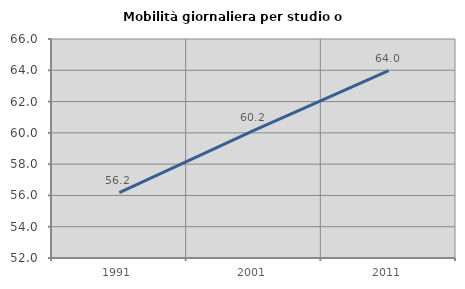
| Category | Mobilità giornaliera per studio o lavoro |
|---|---|
| 1991.0 | 56.177 |
| 2001.0 | 60.155 |
| 2011.0 | 63.971 |